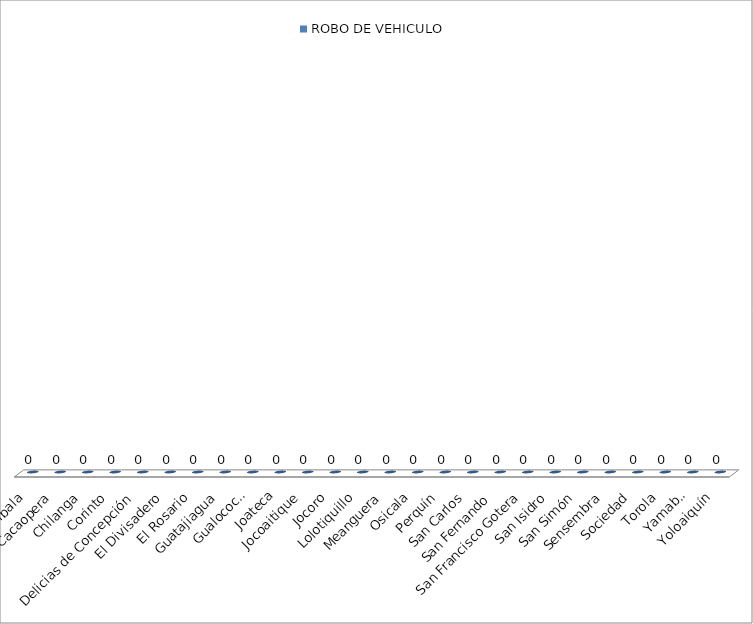
| Category | ROBO DE VEHICULO |
|---|---|
| Arambala | 0 |
| Cacaopera | 0 |
| Chilanga | 0 |
| Corinto | 0 |
| Delicias de Concepción | 0 |
| El Divisadero | 0 |
| El Rosario | 0 |
| Guatajiagua | 0 |
| Gualococti | 0 |
| Joateca | 0 |
| Jocoaitique | 0 |
| Jocoro | 0 |
| Lolotiquillo | 0 |
| Meanguera | 0 |
| Osicala | 0 |
| Perquín | 0 |
| San Carlos | 0 |
| San Fernando | 0 |
| San Francisco Gotera | 0 |
| San Isidro | 0 |
| San Simón | 0 |
| Sensembra | 0 |
| Sociedad | 0 |
| Torola | 0 |
| Yamabal | 0 |
| Yoloaiquín | 0 |